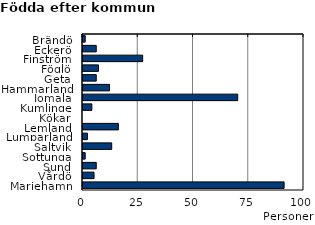
| Category | Series 0 |
|---|---|
| Brändö | 1 |
| Eckerö | 6 |
| Finström | 27 |
| Föglö | 7 |
| Geta | 6 |
| Hammarland | 12 |
| Jomala | 70 |
| Kumlinge | 4 |
| Kökar | 0 |
| Lemland | 16 |
| Lumparland | 2 |
| Saltvik | 13 |
| Sottunga | 1 |
| Sund | 6 |
| Vårdö | 5 |
| Mariehamn | 91 |